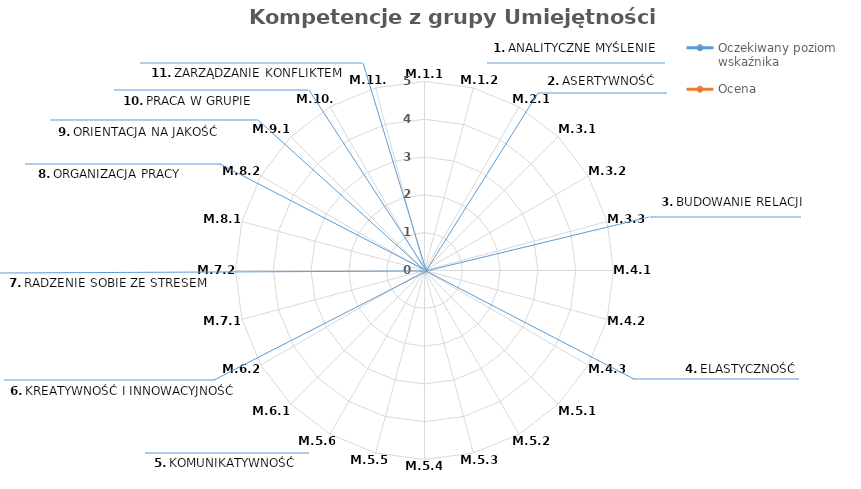
| Category | Oczekiwany poziom wskaźnika | Ocena |
|---|---|---|
| M.1.1 | 0 | 0 |
| M.1.2 | 0 | 0 |
| M.2.1 | 0 | 0 |
| M.3.1 | 0 | 0 |
| M.3.2 | 0 | 0 |
| M.3.3 | 0 | 0 |
| M.4.1 | 0 | 0 |
| M.4.2 | 0 | 0 |
| M.4.3 | 0 | 0 |
| M.5.1 | 0 | 0 |
| M.5.2 | 0 | 0 |
| M.5.3 | 0 | 0 |
| M.5.4 | 0 | 0 |
| M.5.5 | 0 | 0 |
| M.5.6 | 0 | 0 |
| M.6.1 | 0 | 0 |
| M.6.2 | 0 | 0 |
| M.7.1 | 0 | 0 |
| M.7.2 | 0 | 0 |
| M.8.1 | 0 | 0 |
| M.8.2 | 0 | 0 |
| M.9.1 | 0 | 0 |
| M.10.1 | 0 | 0 |
| M.11.1 | 0 | 0 |